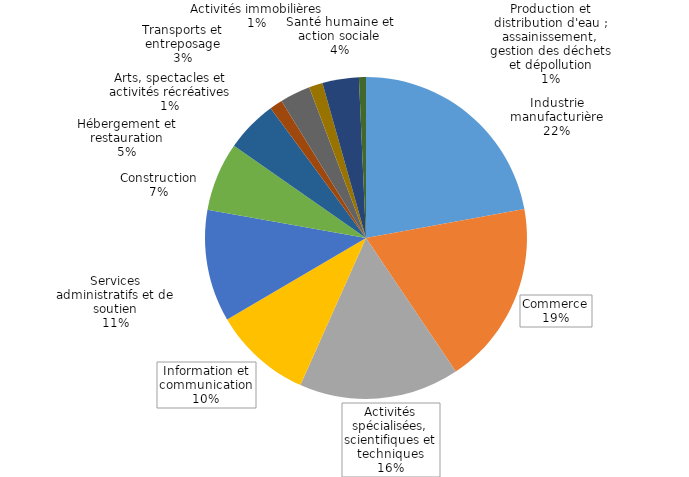
| Category | Series 0 |
|---|---|
| Industrie manufacturière | 0.221 |
| Commerce | 0.185 |
| Activités spécialisées, scientifiques et techniques | 0.161 |
| Information et communication | 0.099 |
| Services administratifs et de soutien | 0.113 |
| Construction | 0.069 |
| Hébergement et restauration | 0.052 |
| Arts, spectacles et activités récréatives | 0.013 |
| Transports et entreposage | 0.031 |
| Activités immobilières | 0.014 |
| Santé humaine et action sociale | 0.037 |
| Production et distribution d'eau ; assainissement, gestion des déchets et dépollution | 0.007 |